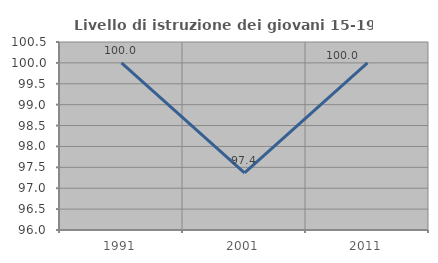
| Category | Livello di istruzione dei giovani 15-19 anni |
|---|---|
| 1991.0 | 100 |
| 2001.0 | 97.368 |
| 2011.0 | 100 |